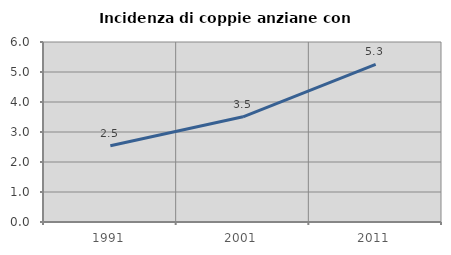
| Category | Incidenza di coppie anziane con figli |
|---|---|
| 1991.0 | 2.544 |
| 2001.0 | 3.506 |
| 2011.0 | 5.256 |